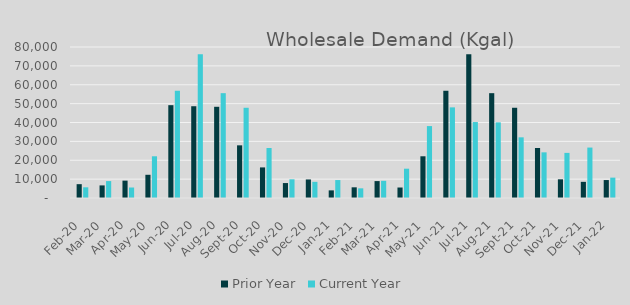
| Category | Prior Year | Current Year |
|---|---|---|
| 2020-02-01 | 7328 | 5662 |
| 2020-03-01 | 6673 | 8964 |
| 2020-04-01 | 9201 | 5557 |
| 2020-05-01 | 12299 | 22105 |
| 2020-06-01 | 49180 | 56817 |
| 2020-07-01 | 48620 | 76109 |
| 2020-08-01 | 48323 | 55541 |
| 2020-09-01 | 27902 | 47807 |
| 2020-10-01 | 16206 | 26480 |
| 2020-11-01 | 7918 | 9900 |
| 2020-12-01 | 9824 | 8560 |
| 2021-01-01 | 4042 | 9512 |
| 2021-02-01 | 5662 | 5125 |
| 2021-03-01 | 8964 | 9106 |
| 2021-04-01 | 5557 | 15528 |
| 2021-05-01 | 22105 | 38104 |
| 2021-06-01 | 56817 | 48016 |
| 2021-07-01 | 76109 | 40242 |
| 2021-08-01 | 55541 | 40077 |
| 2021-09-01 | 47807 | 32142 |
| 2021-10-01 | 26480 | 24194 |
| 2021-11-01 | 9900 | 23901 |
| 2021-12-01 | 8560 | 26722 |
| 2022-01-01 | 9512 | 10791 |